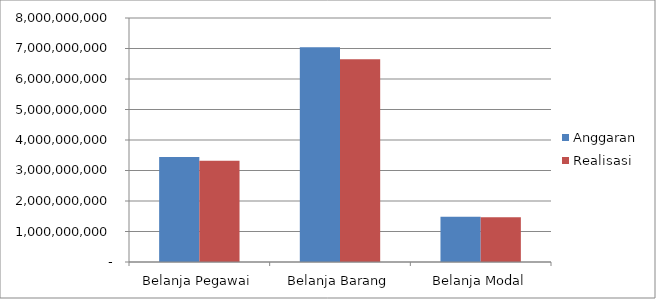
| Category | Anggaran | Realisasi |
|---|---|---|
| Belanja Pegawai | 3443983000 | 3316366778 |
| Belanja Barang | 7044703000 | 6645148395 |
| Belanja Modal | 1483280000 | 1470129550 |